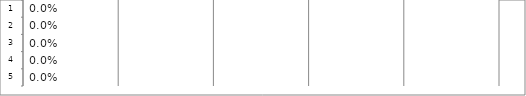
| Category | Series 0 |
|---|---|
| 0 | 0 |
| 1 | 0 |
| 2 | 0 |
| 3 | 0 |
| 4 | 0 |